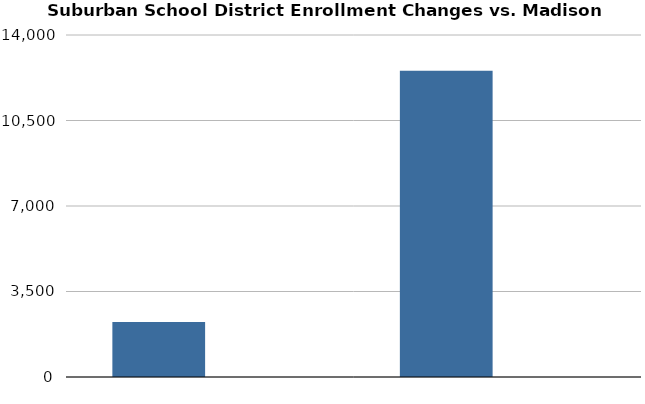
| Category | Change | % Change |
|---|---|---|
| 0 | 2255 |  |
| 1 | 12540 |  |